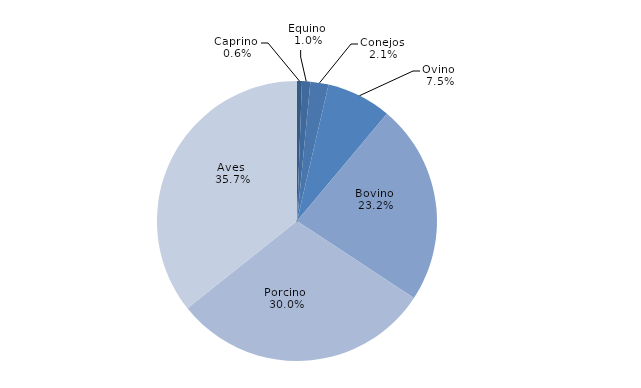
| Category | Series 0 |
|---|---|
| Caprino  | 545.1 |
| Equino  | 932.99 |
| Conejos  | 2019.78 |
| Ovino  | 7226.14 |
| Bovino  | 22372.9 |
| Porcino  | 29013.59 |
| Aves  | 34485.16 |